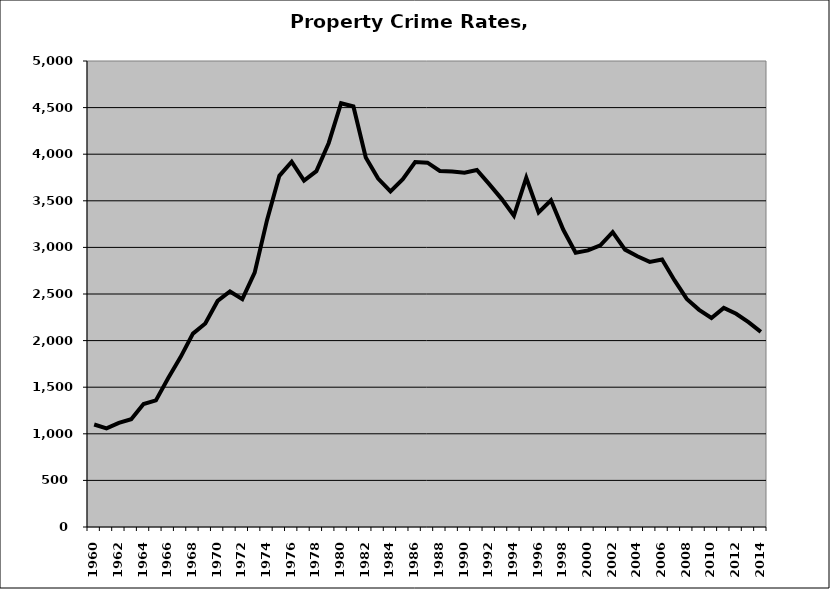
| Category | Property |
|---|---|
| 1960.0 | 1100.076 |
| 1961.0 | 1057.647 |
| 1962.0 | 1117.429 |
| 1963.0 | 1156.655 |
| 1964.0 | 1319.884 |
| 1965.0 | 1358.949 |
| 1966.0 | 1599.6 |
| 1967.0 | 1822.594 |
| 1968.0 | 2075.182 |
| 1969.0 | 2183.531 |
| 1970.0 | 2425.77 |
| 1971.0 | 2526.648 |
| 1972.0 | 2444.364 |
| 1973.0 | 2729.339 |
| 1974.0 | 3292.644 |
| 1975.0 | 3768.014 |
| 1976.0 | 3918.571 |
| 1977.0 | 3717.506 |
| 1978.0 | 3818.681 |
| 1979.0 | 4120.565 |
| 1980.0 | 4546.386 |
| 1981.0 | 4512.358 |
| 1982.0 | 3963.787 |
| 1983.0 | 3737.935 |
| 1984.0 | 3600.859 |
| 1985.0 | 3731.172 |
| 1986.0 | 3915.573 |
| 1987.0 | 3908.998 |
| 1988.0 | 3819.831 |
| 1989.0 | 3815.106 |
| 1990.0 | 3801.2 |
| 1991.0 | 3830.733 |
| 1992.0 | 3679.196 |
| 1993.0 | 3520.967 |
| 1994.0 | 3339.519 |
| 1995.0 | 3747.502 |
| 1996.0 | 3376.438 |
| 1997.0 | 3505.82 |
| 1998.0 | 3189.099 |
| 1999.0 | 2943.564 |
| 2000.0 | 2967.341 |
| 2001.0 | 3023.022 |
| 2002.0 | 3163.558 |
| 2003.0 | 2976.027 |
| 2004.0 | 2904.768 |
| 2005.0 | 2845.028 |
| 2006.0 | 2870.341 |
| 2007.0 | 2648.554 |
| 2008.0 | 2447.439 |
| 2009.0 | 2329.899 |
| 2010.0 | 2242.516 |
| 2011.0 | 2351.198 |
| 2012.0 | 2288.004 |
| 2013.0 | 2198.205 |
| 2014.0 | 2093.768 |